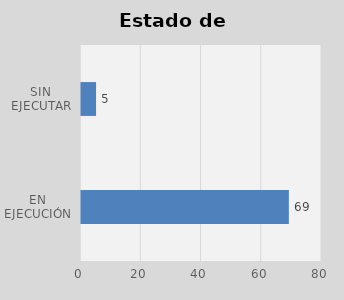
| Category | Total |
|---|---|
| EN EJECUCIÓN | 69 |
| SIN EJECUTAR | 5 |